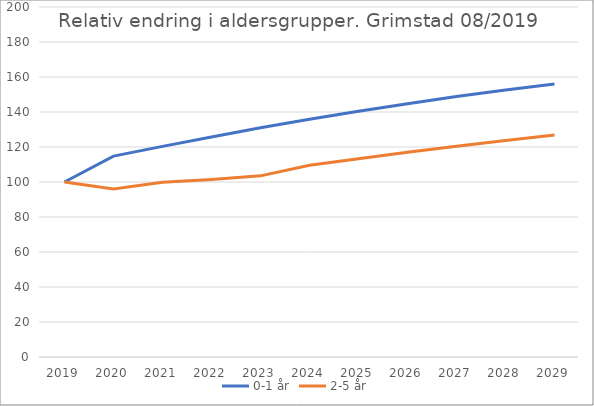
| Category | 0-1 år | 2-5 år |
|---|---|---|
| 2019 | 100 | 100 |
| 2020 | 114.775 | 95.949 |
| 2021 | 120.359 | 99.862 |
| 2022 | 125.768 | 101.436 |
| 2023 | 130.957 | 103.514 |
| 2024 | 135.845 | 109.548 |
| 2025 | 140.429 | 113.308 |
| 2026 | 144.758 | 116.962 |
| 2027 | 148.804 | 120.438 |
| 2028 | 152.55 | 123.724 |
| 2029 | 156.001 | 126.801 |